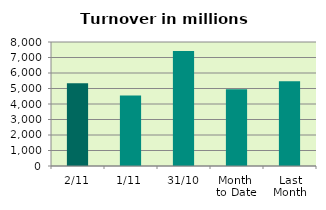
| Category | Series 0 |
|---|---|
| 2/11 | 5338.138 |
| 1/11 | 4556.109 |
| 31/10 | 7417.937 |
| Month 
to Date | 4947.123 |
| Last
Month | 5472.473 |